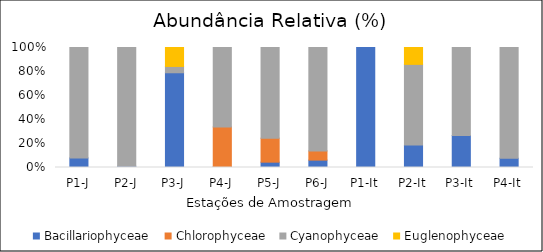
| Category | Bacillariophyceae | Chlorophyceae | Cyanophyceae | Euglenophyceae |
|---|---|---|---|---|
| P1-J | 7.981 | 0 | 92.019 | 0 |
| P2-J | 1.069 | 0 | 98.931 | 0 |
| P3-J | 78.947 | 0 | 5.263 | 15.789 |
| P4-J | 0.701 | 33.1 | 66.199 | 0 |
| P5-J | 4.444 | 20 | 75.556 | 0 |
| P6-J | 6.154 | 7.692 | 86.154 | 0 |
| P1-It | 100 | 0 | 0 | 0 |
| P2-It | 18.75 | 0 | 67.188 | 14.062 |
| P3-It | 26.667 | 0 | 73.333 | 0 |
| P4-It | 7.692 | 0 | 92.308 | 0 |